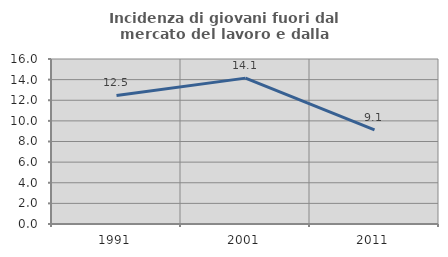
| Category | Incidenza di giovani fuori dal mercato del lavoro e dalla formazione  |
|---|---|
| 1991.0 | 12.469 |
| 2001.0 | 14.145 |
| 2011.0 | 9.135 |